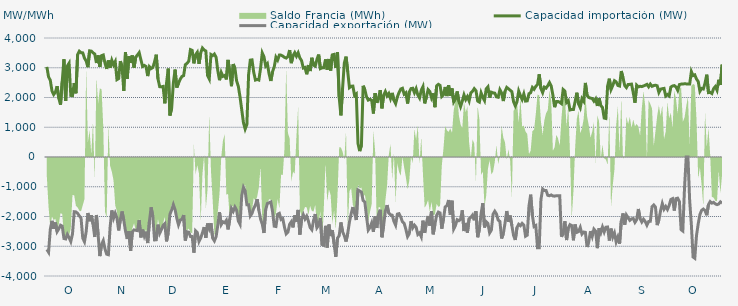
| Category | Capacidad importación (MW) | Capacidad exportación (MW) |
|---|---|---|
| 0 | 3029.417 | -3108.292 |
| 1900-01-01 | 2693.417 | -3201.125 |
| 1900-01-02 | 2579.5 | -2439 |
| 1900-01-03 | 2220.833 | -2146.167 |
| 1900-01-04 | 2100 | -2410.292 |
| 1900-01-05 | 2179.167 | -2202.083 |
| 1900-01-06 | 2381.25 | -2508.5 |
| 1900-01-07 | 1970.833 | -2414.375 |
| 1900-01-08 | 1758.333 | -2292.792 |
| 1900-01-09 | 2544 | -2324.083 |
| 1900-01-10 | 3285.125 | -2739.75 |
| 1900-01-11 | 1885.375 | -2754.917 |
| 1900-01-12 | 3057.958 | -2601 |
| 1900-01-13 | 3152.583 | -2708.375 |
| 1900-01-14 | 2068.833 | -2840.833 |
| 1900-01-15 | 2060.917 | -2586.417 |
| 1900-01-16 | 2484.25 | -1839.417 |
| 1900-01-17 | 2141.208 | -1845.833 |
| 1900-01-18 | 3445.375 | -1893.75 |
| 1900-01-19 | 3555.25 | -1979.583 |
| 1900-01-20 | 3506.875 | -2054.167 |
| 1900-01-21 | 3499.292 | -2730 |
| 1900-01-22 | 3321.917 | -2848.375 |
| 1900-01-23 | 3225.583 | -2505.583 |
| 1900-01-24 | 3019.583 | -1882.958 |
| 1900-01-25 | 3568.667 | -2157.833 |
| 1900-01-26 | 3559.375 | -1957.75 |
| 1900-01-27 | 3503.125 | -2252.375 |
| 1900-01-28 | 3464.458 | -2689.458 |
| 1900-01-29 | 3159.52 | -1949.52 |
| 1900-01-30 | 3414.875 | -2624.75 |
| 1900-01-31 | 3028.417 | -3331.875 |
| 1900-02-01 | 3406.833 | -2936.5 |
| 1900-02-02 | 3428.875 | -2811.25 |
| 1900-02-03 | 3154.208 | -3088.625 |
| 1900-02-04 | 2961.542 | -3268.083 |
| 1900-02-05 | 3246.75 | -3285.125 |
| 1900-02-06 | 2998.792 | -2359.333 |
| 1900-02-07 | 3250.625 | -1795.833 |
| 1900-02-08 | 3098.083 | -2058.458 |
| 1900-02-09 | 3208.458 | -1889.583 |
| 1900-02-10 | 2600.833 | -2050 |
| 1900-02-11 | 2636.458 | -2468.208 |
| 1900-02-12 | 3221.75 | -2100 |
| 1900-02-13 | 3030.917 | -1831.25 |
| 1900-02-14 | 2221.417 | -2127.083 |
| 1900-02-15 | 3529.833 | -2490.5 |
| 1900-02-16 | 2631.583 | -2756.25 |
| 1900-02-17 | 3389.417 | -2493.667 |
| 1900-02-18 | 3161.917 | -3158.375 |
| 1900-02-19 | 3412.417 | -2518.792 |
| 1900-02-20 | 3004.917 | -2450.333 |
| 1900-02-21 | 3360.75 | -2463.25 |
| 1900-02-22 | 3427.958 | -2474.292 |
| 1900-02-23 | 3506.917 | -2123.5 |
| 1900-02-24 | 3269.708 | -2701.708 |
| 1900-02-25 | 3043.333 | -2440.417 |
| 1900-02-26 | 3078.833 | -2660.667 |
| 1900-02-27 | 3042.542 | -2510.25 |
| 1900-02-28 | 2720.083 | -2892.208 |
| 1900-02-28 | 3035.792 | -2156.833 |
| 1900-03-01 | 2973.125 | -1691.667 |
| 1900-03-02 | 3008.708 | -2006.25 |
| 1900-03-03 | 3198.417 | -2788.271 |
| 1900-03-04 | 3439.5 | -2780.875 |
| 1900-03-05 | 2626.625 | -2273 |
| 1900-03-06 | 2364.583 | -2564.167 |
| 1900-03-07 | 2360.417 | -2440.708 |
| 1900-03-08 | 2372.917 | -2302.125 |
| 1900-03-09 | 1804.167 | -2241.25 |
| 1900-03-10 | 2476.875 | -2836.292 |
| 1900-03-11 | 2972.208 | -2552.292 |
| 1900-03-12 | 1394.917 | -1922 |
| 1900-03-13 | 1635.417 | -1780.667 |
| 1900-03-14 | 2487.208 | -1602.083 |
| 1900-03-15 | 2938.333 | -1770.833 |
| 1900-03-16 | 2333.708 | -2058.75 |
| 1900-03-17 | 2480.333 | -2280.5 |
| 1900-03-18 | 2612.458 | -2120.333 |
| 1900-03-19 | 2705.792 | -2095.25 |
| 1900-03-20 | 2735.375 | -1951.833 |
| 1900-03-21 | 3100.375 | -2807.583 |
| 1900-03-22 | 3154.125 | -2514.417 |
| 1900-03-23 | 3216.042 | -2530.208 |
| 1900-03-24 | 3609.167 | -2672.875 |
| 1900-03-25 | 3585.958 | -2674.5 |
| 1900-03-26 | 3148.417 | -3214.25 |
| 1900-03-27 | 3433.542 | -2480.667 |
| 1900-03-28 | 3518.5 | -2539.5 |
| 1900-03-29 | 3130.292 | -2838.583 |
| 1900-03-30 | 3499.167 | -2718.417 |
| 1900-03-31 | 3663.042 | -2554.083 |
| 1900-04-01 | 3596.708 | -2355.75 |
| 1900-04-02 | 3562.792 | -2716.417 |
| 1900-04-03 | 2738.75 | -2235.333 |
| 1900-04-04 | 2625.667 | -2410 |
| 1900-04-05 | 3444.083 | -2226.333 |
| 1900-04-06 | 3408.75 | -2728 |
| 1900-04-07 | 3460.583 | -2820.25 |
| 1900-04-08 | 3350.75 | -2676.083 |
| 1900-04-09 | 2899.917 | -2289.583 |
| 1900-04-10 | 2581.708 | -1858.083 |
| 1900-04-11 | 2842.042 | -2272.417 |
| 1900-04-12 | 2711.125 | -2177.417 |
| 1900-04-13 | 2740.458 | -2209.667 |
| 1900-04-14 | 2608.583 | -2127.083 |
| 1900-04-15 | 3264.042 | -2433.083 |
| 1900-04-16 | 2836.375 | -2085.417 |
| 1900-04-17 | 2379.792 | -1727.083 |
| 1900-04-18 | 3123.25 | -1827.083 |
| 1900-04-19 | 2982.792 | -1681.25 |
| 1900-04-20 | 2556.667 | -1789.667 |
| 1900-04-21 | 2375.667 | -2149.333 |
| 1900-04-22 | 2017.208 | -2261.458 |
| 1900-04-23 | 1585 | -1297.917 |
| 1900-04-24 | 1154.167 | -1022.917 |
| 1900-04-25 | 939.583 | -1143.75 |
| 1900-04-26 | 1093.75 | -1604.167 |
| 1900-04-27 | 2763.333 | -1604.167 |
| 1900-04-28 | 3256.375 | -1980.875 |
| 1900-04-29 | 3265.958 | -1897.917 |
| 1900-04-30 | 2849.625 | -1726.333 |
| 1900-05-01 | 2586.542 | -1614.583 |
| 1900-05-02 | 2607.375 | -1416.667 |
| 1900-05-03 | 2587.208 | -1789.583 |
| 1900-05-04 | 2978.5 | -2081.25 |
| 1900-05-05 | 3497.083 | -2256.292 |
| 1900-05-06 | 3370 | -2554.542 |
| 1900-05-07 | 3061.75 | -1771.917 |
| 1900-05-08 | 3134.875 | -1562.5 |
| 1900-05-09 | 2789.5 | -1537.5 |
| 1900-05-10 | 2555.75 | -1512.5 |
| 1900-05-11 | 2867.083 | -1825 |
| 1900-05-12 | 3026.833 | -2326.458 |
| 1900-05-13 | 3354.833 | -2337.292 |
| 1900-05-14 | 3258.292 | -1924.167 |
| 1900-05-15 | 3426.125 | -1893.75 |
| 1900-05-16 | 3424.167 | -2100 |
| 1900-05-17 | 3391.208 | -2070.833 |
| 1900-05-18 | 3348.208 | -2362.208 |
| 1900-05-19 | 3325.958 | -2584.917 |
| 1900-05-20 | 3372.292 | -2526.125 |
| 1900-05-21 | 3594.458 | -2261.833 |
| 1900-05-22 | 3154.208 | -2177.542 |
| 1900-05-23 | 3406.542 | -2366 |
| 1900-05-24 | 3506.792 | -1962 |
| 1900-05-25 | 3388.292 | -2170.833 |
| 1900-05-26 | 3502.625 | -1778.917 |
| 1900-05-27 | 3329.875 | -2606.583 |
| 1900-05-28 | 3238.958 | -2081.917 |
| 1900-05-29 | 2990.542 | -1937.25 |
| 1900-05-30 | 3009.542 | -2084.208 |
| 1900-05-31 | 2780.333 | -1987.25 |
| 1900-06-01 | 3090.792 | -2157.25 |
| 1900-06-02 | 2889.375 | -2369.167 |
| 1900-06-03 | 3335.375 | -2443.917 |
| 1900-06-04 | 3086.625 | -2135.417 |
| 1900-06-05 | 3054 | -1916.417 |
| 1900-06-06 | 3285.417 | -2373 |
| 1900-06-07 | 3443.292 | -2289.333 |
| 1900-06-08 | 2971.208 | -2047.917 |
| 1900-06-09 | 2996.292 | -2944.458 |
| 1900-06-10 | 3001.167 | -2971.542 |
| 1900-06-11 | 3281.375 | -2314.833 |
| 1900-06-12 | 2936.042 | -3043.167 |
| 1900-06-13 | 3294.792 | -2270.333 |
| 1900-06-14 | 2907.375 | -2657.667 |
| 1900-06-15 | 3433.583 | -2462.5 |
| 1900-06-16 | 3449.042 | -2914.583 |
| 1900-06-17 | 2992.458 | -3358.458 |
| 1900-06-18 | 3524.375 | -2728.208 |
| 1900-06-19 | 2000 | -2643.375 |
| 1900-06-20 | 1400 | -2200 |
| 1900-06-21 | 2323.375 | -2514.75 |
| 1900-06-22 | 3160.167 | -2645.333 |
| 1900-06-23 | 3372.083 | -2842.167 |
| 1900-06-24 | 2865.739 | -2564.565 |
| 1900-06-25 | 2332.667 | -2181.833 |
| 1900-06-26 | 2376.083 | -1906.25 |
| 1900-06-27 | 2381.25 | -1683.333 |
| 1900-06-28 | 2070.833 | -1891.667 |
| 1900-06-29 | 2120.083 | -2118.75 |
| 1900-06-30 | 449.25 | -1108.333 |
| 1900-07-01 | 200 | -1139.583 |
| 1900-07-02 | 395.833 | -1179.167 |
| 1900-07-03 | 2393.75 | -1462.5 |
| 1900-07-04 | 2262.25 | -1512.5 |
| 1900-07-05 | 2020.833 | -2007.167 |
| 1900-07-06 | 1912.5 | -2455.208 |
| 1900-07-07 | 1939.583 | -2371.125 |
| 1900-07-08 | 1908.333 | -2217.958 |
| 1900-07-09 | 1462.5 | -2517.542 |
| 1900-07-10 | 2145.208 | -2000.417 |
| 1900-07-11 | 1820.833 | -2386.167 |
| 1900-07-12 | 1983.333 | -1930.75 |
| 1900-07-13 | 2245.833 | -1772.917 |
| 1900-07-14 | 1635.417 | -2697.5 |
| 1900-07-15 | 2079.167 | -2299.625 |
| 1900-07-16 | 2200 | -1818.75 |
| 1900-07-17 | 2052.083 | -1616.667 |
| 1900-07-18 | 2133.333 | -1885.417 |
| 1900-07-19 | 1962.5 | -1940.792 |
| 1900-07-20 | 2154.167 | -1955.875 |
| 1900-07-21 | 1906.25 | -2160.458 |
| 1900-07-22 | 1791.667 | -2289.583 |
| 1900-07-23 | 2014.583 | -1920.333 |
| 1900-07-24 | 2166.667 | -1904.167 |
| 1900-07-25 | 2285.417 | -2016.25 |
| 1900-07-26 | 2310.417 | -2177.917 |
| 1900-07-27 | 2114.583 | -2230.875 |
| 1900-07-28 | 2160.417 | -2431.625 |
| 1900-07-29 | 1797.917 | -2674.417 |
| 1900-07-30 | 2180.625 | -2574 |
| 1900-07-31 | 2300 | -2155.333 |
| 1900-08-01 | 2310.417 | -2380.708 |
| 1900-08-02 | 2160.417 | -2290.5 |
| 1900-08-03 | 2295.833 | -2360.958 |
| 1900-08-04 | 2083.333 | -2603 |
| 1900-08-05 | 1983.333 | -2551.458 |
| 1900-08-06 | 2243.75 | -2680.375 |
| 1900-08-07 | 2364.583 | -2139.583 |
| 1900-08-08 | 1802.083 | -2551.375 |
| 1900-08-09 | 2012.5 | -2222.583 |
| 1900-08-10 | 2264.583 | -1983.333 |
| 1900-08-11 | 2200 | -2304.167 |
| 1900-08-12 | 1991.667 | -1823 |
| 1900-08-13 | 2139.583 | -2598.667 |
| 1900-08-14 | 1674.583 | -2262.5 |
| 1900-08-15 | 2391.667 | -1958.333 |
| 1900-08-16 | 2442.875 | -1852.083 |
| 1900-08-17 | 2406.25 | -1879.167 |
| 1900-08-18 | 2035.417 | -2408.5 |
| 1900-08-19 | 2093.75 | -2077.083 |
| 1900-08-20 | 2353.042 | -1679.167 |
| 1900-08-21 | 2047.917 | -1637.5 |
| 1900-08-22 | 2414.917 | -1445.833 |
| 1900-08-23 | 2054.167 | -1935.417 |
| 1900-08-24 | 2304.167 | -1468.75 |
| 1900-08-25 | 1852.083 | -2413.583 |
| 1900-08-26 | 1950 | -2298.583 |
| 1900-08-27 | 2204.167 | -2108.333 |
| 1900-08-28 | 1870.833 | -2142.875 |
| 1900-08-29 | 1693.75 | -2094.083 |
| 1900-08-30 | 1875 | -1793.75 |
| 1900-08-31 | 2087.5 | -2489.25 |
| 1900-09-01 | 1929.167 | -2216.167 |
| 1900-09-02 | 2031.25 | -2542 |
| 1900-09-03 | 1885.417 | -2072.833 |
| 1900-09-04 | 2156.25 | -2029.167 |
| 1900-09-05 | 2208.333 | -1953 |
| 1900-09-06 | 2297.917 | -2127.083 |
| 1900-09-07 | 2229.167 | -1822.917 |
| 1900-09-08 | 1879.167 | -2695.583 |
| 1900-09-09 | 1845.833 | -2427.667 |
| 1900-09-10 | 2156.25 | -1908.417 |
| 1900-09-11 | 2010.417 | -1551.375 |
| 1900-09-12 | 1897.625 | -2367.333 |
| 1900-09-13 | 2291.667 | -2179.167 |
| 1900-09-14 | 2358.333 | -2236.833 |
| 1900-09-15 | 1997.917 | -2551.708 |
| 1900-09-16 | 2179.167 | -2457.875 |
| 1900-09-17 | 2156.25 | -1922.667 |
| 1900-09-18 | 2145.833 | -1823.917 |
| 1900-09-19 | 2022.917 | -1916.417 |
| 1900-09-20 | 2008.333 | -2121.167 |
| 1900-09-21 | 2260.417 | -2164.667 |
| 1900-09-22 | 2152.083 | -2739.958 |
| 1900-09-23 | 1881 | -2582.833 |
| 1900-09-24 | 2206.25 | -2222.083 |
| 1900-09-25 | 2339.583 | -1816.667 |
| 1900-09-26 | 2293.75 | -2177.833 |
| 1900-09-27 | 2245.833 | -1968.75 |
| 1900-09-28 | 2195.833 | -2304.458 |
| 1900-09-29 | 1858.208 | -2638.917 |
| 1900-09-30 | 1718.75 | -2788.083 |
| 1900-10-01 | 1858.333 | -2369.542 |
| 1900-10-02 | 2216.667 | -2260.583 |
| 1900-10-03 | 2066.667 | -2309.375 |
| 1900-10-04 | 1935.417 | -2231 |
| 1900-10-05 | 2118.292 | -2285.25 |
| 1900-10-06 | 1879.583 | -2663 |
| 1900-10-07 | 1887.5 | -2627.5 |
| 1900-10-08 | 2127.083 | -1647.917 |
| 1900-10-09 | 2162.5 | -1266.667 |
| 1900-10-10 | 2338.667 | -1964.583 |
| 1900-10-11 | 2277.083 | -2337.25 |
| 1900-10-12 | 2373.75 | -2304.167 |
| 1900-10-13 | 2435.083 | -3048.333 |
| 1900-10-14 | 2780.708 | -3048.208 |
| 1900-10-15 | 2300 | -1435 |
| 1900-10-16 | 2164.583 | -1077.083 |
| 1900-10-17 | 2350 | -1125 |
| 1900-10-18 | 2314.583 | -1125 |
| 1900-10-19 | 2395.625 | -1287.5 |
| 1900-10-20 | 2501.583 | -1302.083 |
| 1900-10-21 | 2389.417 | -1275 |
| 1900-10-22 | 2080.375 | -1308.333 |
| 1900-10-23 | 1675 | -1316.667 |
| 1900-10-24 | 1862.5 | -1300 |
| 1900-10-25 | 1866.708 | -1300 |
| 1900-10-26 | 1837.292 | -1300 |
| 1900-10-27 | 1793.75 | -2680.333 |
| 1900-10-28 | 2268.333 | -2563.75 |
| 1900-10-29 | 2217.333 | -2160.333 |
| 1900-10-30 | 1831.25 | -2791.75 |
| 1900-10-31 | 1890.083 | -2386.583 |
| 1900-11-01 | 1581.667 | -2273.25 |
| 1900-11-02 | 1595.833 | -2304.167 |
| 1900-11-03 | 1593.75 | -2799.042 |
| 1900-11-04 | 1860.75 | -2268.667 |
| 1900-11-05 | 2160.5 | -2533.875 |
| 1900-11-06 | 1785.417 | -2508.667 |
| 1900-11-07 | 1658.333 | -2368.167 |
| 1900-11-08 | 1958.333 | -2590.5 |
| 1900-11-09 | 1875.083 | -2522 |
| 1900-11-10 | 2489.792 | -2532.75 |
| 1900-11-11 | 2064.583 | -3024.833 |
| 1900-11-12 | 2001.333 | -2838.125 |
| 1900-11-13 | 1979.167 | -2490.417 |
| 1900-11-14 | 1966.667 | -2671.375 |
| 1900-11-15 | 1877.792 | -2424.333 |
| 1900-11-16 | 1957.75 | -2493.167 |
| 1900-11-17 | 1716.667 | -3063.708 |
| 1900-11-18 | 1978.5 | -2394.708 |
| 1900-11-19 | 1729.167 | -2549 |
| 1900-11-20 | 1666.667 | -2355.5 |
| 1900-11-21 | 1308.333 | -2520.458 |
| 1900-11-22 | 1293.75 | -2359.417 |
| 1900-11-23 | 2383.833 | -2353.167 |
| 1900-11-24 | 2632.25 | -2807.083 |
| 1900-11-25 | 2269.167 | -2407.042 |
| 1900-11-26 | 2400.75 | -2695.042 |
| 1900-11-27 | 2564.417 | -2553.583 |
| 1900-11-28 | 2525.583 | -2853.583 |
| 1900-11-29 | 2404.5 | -2690.292 |
| 1900-11-30 | 2386.042 | -2912.083 |
| 1900-12-01 | 2890.042 | -2155.708 |
| 1900-12-02 | 2668.625 | -1896.5 |
| 1900-12-03 | 2403.083 | -2272.75 |
| 1900-12-04 | 2332.833 | -1950 |
| 1900-12-05 | 2437.5 | -2037.5 |
| 1900-12-06 | 2441.667 | -2129 |
| 1900-12-07 | 2450 | -2079.167 |
| 1900-12-08 | 2159.292 | -2066.667 |
| 1900-12-09 | 1825 | -2195.667 |
| 1900-12-10 | 2412.5 | -2108.333 |
| 1900-12-11 | 2355.5 | -1747.917 |
| 1900-12-12 | 2377.083 | -2070.833 |
| 1900-12-13 | 2366.667 | -2185.333 |
| 1900-12-14 | 2387.5 | -2091.667 |
| 1900-12-15 | 2412.5 | -2164.583 |
| 1900-12-16 | 2443 | -2291.292 |
| 1900-12-17 | 2360.417 | -2168.75 |
| 1900-12-18 | 2450 | -2160.417 |
| 1900-12-19 | 2375 | -1668.75 |
| 1900-12-20 | 2402.083 | -1612.5 |
| 1900-12-21 | 2412 | -1683.333 |
| 1900-12-22 | 2393.75 | -2289.583 |
| 1900-12-23 | 2168.625 | -2114.083 |
| 1900-12-24 | 2281.25 | -1800 |
| 1900-12-25 | 2295.833 | -1566.667 |
| 1900-12-26 | 2306.25 | -1754.167 |
| 1900-12-27 | 2050 | -1662.5 |
| 1900-12-28 | 2100 | -1762.5 |
| 1900-12-29 | 2052.083 | -1629.167 |
| 1900-12-30 | 2351.708 | -1429.167 |
| 1900-12-31 | 2387.5 | -1400 |
| 1901-01-01 | 2400 | -1800 |
| 1901-01-02 | 2355.875 | -1400 |
| 1901-01-03 | 2239.583 | -1383.333 |
| 1901-01-04 | 2435.417 | -1500 |
| 1901-01-05 | 2450 | -2442.875 |
| 1901-01-06 | 2455.875 | -2487.042 |
| 1901-01-07 | 2459.792 | -1025 |
| 1901-01-08 | 2457.708 | 0 |
| 1901-01-09 | 2450 | 0 |
| 1901-01-10 | 2450 | -1462.5 |
| 1901-01-11 | 2870.833 | -2280.5 |
| 1901-01-12 | 2735.958 | -3362.458 |
| 1901-01-13 | 2761.833 | -3404.708 |
| 1901-01-14 | 2618.708 | -2638.958 |
| 1901-01-15 | 2538.583 | -2247.25 |
| 1901-01-16 | 2208.333 | -1933.333 |
| 1901-01-17 | 2304.167 | -1791.667 |
| 1901-01-18 | 2285.083 | -1750 |
| 1901-01-19 | 2485.708 | -1800 |
| 1901-01-20 | 2766.917 | -1958.333 |
| 1901-01-21 | 2164.458 | -1600 |
| 1901-01-22 | 2172.792 | -1500 |
| 1901-01-23 | 2133.333 | -1550 |
| 1901-01-24 | 2297.917 | -1525 |
| 1901-01-25 | 2366.667 | -1575 |
| 1901-01-26 | 2243.25 | -1600 |
| 1901-01-27 | 2598.52 | -1580 |
| 1901-01-28 | 2420.167 | -1508.333 |
| 1901-01-29 | 3106.25 | -1550 |